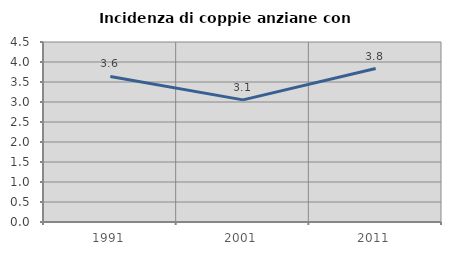
| Category | Incidenza di coppie anziane con figli |
|---|---|
| 1991.0 | 3.64 |
| 2001.0 | 3.053 |
| 2011.0 | 3.836 |